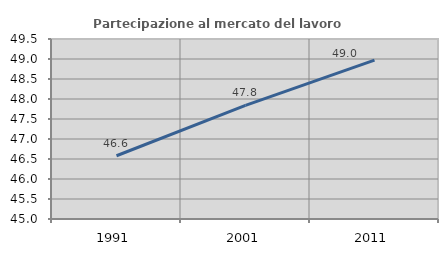
| Category | Partecipazione al mercato del lavoro  femminile |
|---|---|
| 1991.0 | 46.581 |
| 2001.0 | 47.839 |
| 2011.0 | 48.97 |